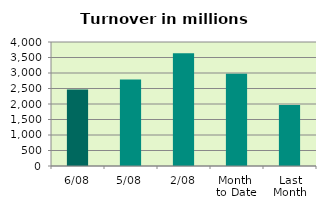
| Category | Series 0 |
|---|---|
| 6/08 | 2465.523 |
| 5/08 | 2794.196 |
| 2/08 | 3636.382 |
| Month 
to Date | 2976.704 |
| Last
Month | 1965.856 |